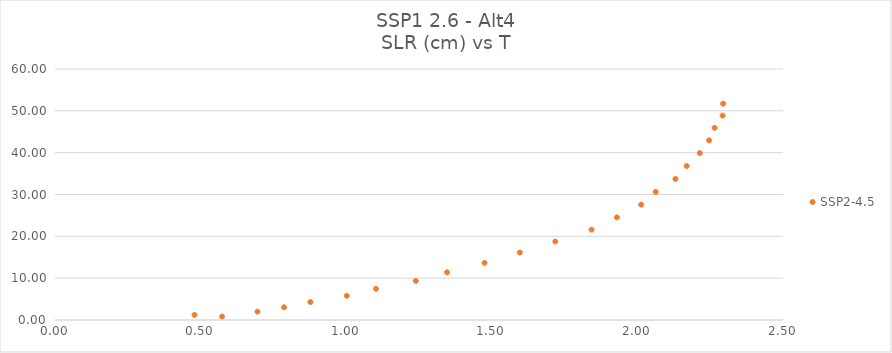
| Category | SSP2-4.5 |
|---|---|
| 0.573801925 | 0.83 |
| 0.479031654 | 1.225 |
| 0.695197934 | 2.004 |
| 0.786748548 | 3.047 |
| 0.877021499 | 4.302 |
| 1.001775485 | 5.786 |
| 1.102283052 | 7.449 |
| 1.238955881 | 9.339 |
| 1.346436615 | 11.401 |
| 1.475037707 | 13.667 |
| 1.59632986 | 16.121 |
| 1.718199577 | 18.762 |
| 1.842563801 | 21.594 |
| 1.929470907 | 24.533 |
| 2.013009707 | 27.568 |
| 2.062983728 | 30.62 |
| 2.130679874 | 33.724 |
| 2.169177819 | 36.812 |
| 2.214339789 | 39.895 |
| 2.246419366 | 42.944 |
| 2.265132815 | 45.927 |
| 2.292656248 | 48.864 |
| 2.294557507 | 51.701 |